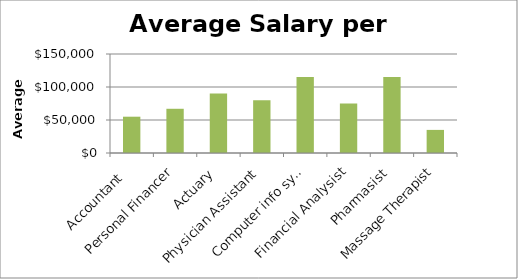
| Category | Series 0 |
|---|---|
| Accountant  | 55000 |
| Personal Financer | 67000 |
| Actuary | 90000 |
| Physician Assistant | 80000 |
| Computer info sys. | 115000 |
| Financial Analysist | 75000 |
| Pharmasist | 115000 |
| Massage Therapist | 35000 |